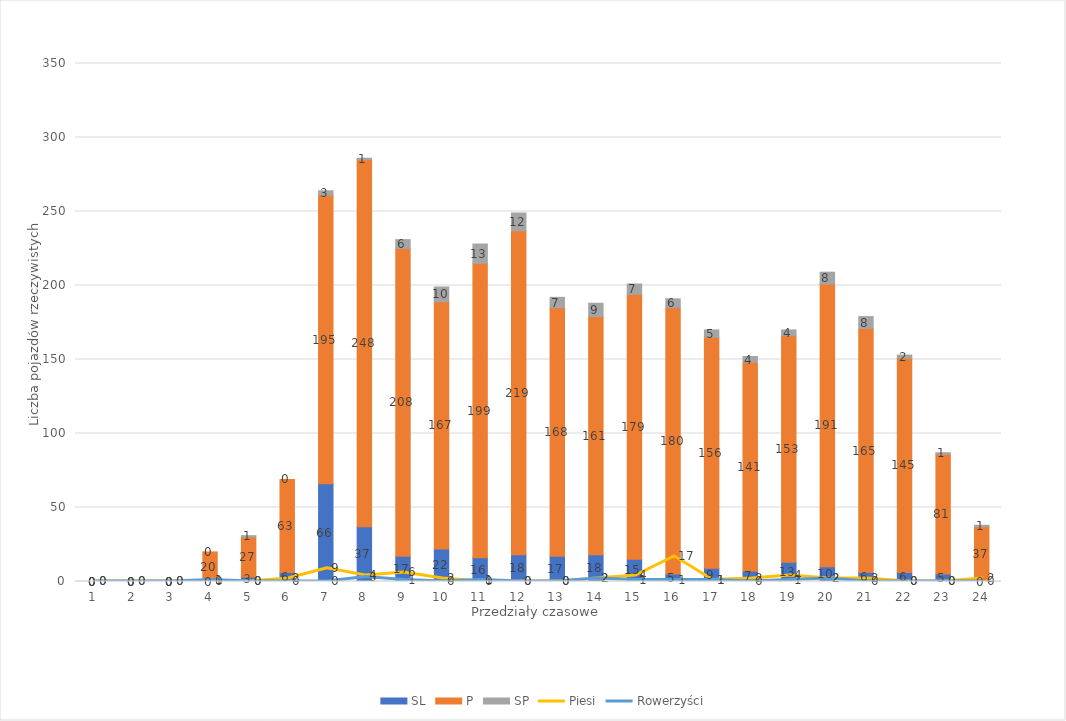
| Category | SL | P | SP |
|---|---|---|---|
| 0 | 0 | 0 | 0 |
| 1 | 0 | 0 | 0 |
| 2 | 0 | 0 | 0 |
| 3 | 0 | 20 | 0 |
| 4 | 3 | 27 | 1 |
| 5 | 6 | 63 | 0 |
| 6 | 66 | 195 | 3 |
| 7 | 37 | 248 | 1 |
| 8 | 17 | 208 | 6 |
| 9 | 22 | 167 | 10 |
| 10 | 16 | 199 | 13 |
| 11 | 18 | 219 | 12 |
| 12 | 17 | 168 | 7 |
| 13 | 18 | 161 | 9 |
| 14 | 15 | 179 | 7 |
| 15 | 5 | 180 | 6 |
| 16 | 9 | 156 | 5 |
| 17 | 7 | 141 | 4 |
| 18 | 13 | 153 | 4 |
| 19 | 10 | 191 | 8 |
| 20 | 6 | 165 | 8 |
| 21 | 6 | 145 | 2 |
| 22 | 5 | 81 | 1 |
| 23 | 0 | 37 | 1 |